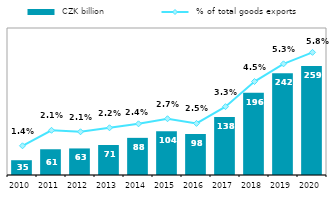
| Category |  CZK billion |
|---|---|
| 2010.0 | 35.22 |
| 2011.0 | 61.281 |
| 2012.0 | 63.24 |
| 2013.0 | 71.383 |
| 2014.0 | 88.432 |
| 2015.0 | 104.021 |
| 2016.0 | 97.651 |
| 2017.0 | 138.167 |
| 2018.0 | 196.02 |
| 2019.0 | 242.408 |
| 2020.0 | 259.421 |